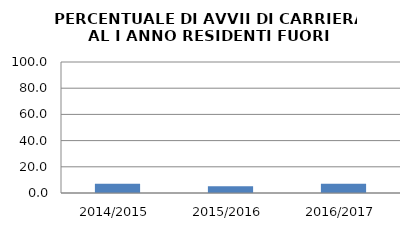
| Category | 2014/2015 2015/2016 2016/2017 |
|---|---|
| 2014/2015 | 7.071 |
| 2015/2016 | 5.128 |
| 2016/2017 | 7.143 |